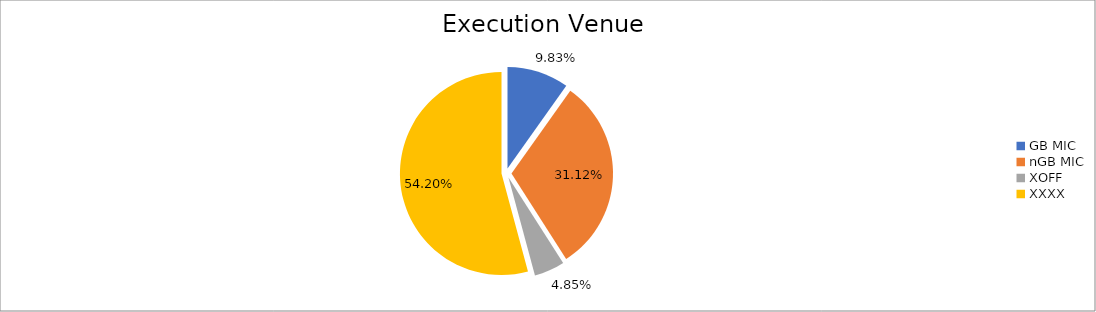
| Category | Series 0 |
|---|---|
| GB MIC | 908154.851 |
| nGB MIC | 2875469.109 |
| XOFF | 447876.042 |
| XXXX | 5007605.648 |